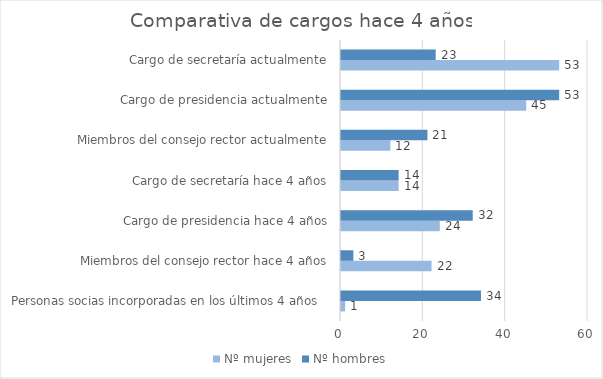
| Category | Nº mujeres | Nº hombres |
|---|---|---|
| Personas socias incorporadas en los últimos 4 años   | 1 | 34 |
| Miembros del consejo rector hace 4 años | 22 | 3 |
| Cargo de presidencia hace 4 años | 24 | 32 |
| Cargo de secretaría hace 4 años | 14 | 14 |
| Miembros del consejo rector actualmente | 12 | 21 |
| Cargo de presidencia actualmente | 45 | 53 |
| Cargo de secretaría actualmente | 53 | 23 |